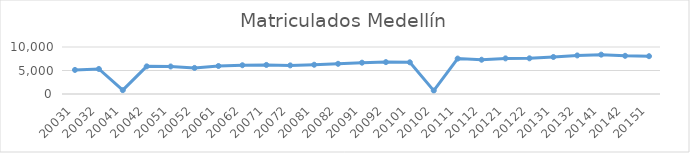
| Category | Matriculados Medellín |
|---|---|
| 20031 | 5121 |
| 20032 | 5326 |
| 20041 | 814 |
| 20042 | 5878 |
| 20051 | 5853 |
| 20052 | 5546 |
| 20061 | 5957 |
| 20062 | 6121 |
| 20071 | 6184 |
| 20072 | 6090 |
| 20081 | 6225 |
| 20082 | 6424 |
| 20091 | 6664 |
| 20092 | 6784 |
| 20101 | 6742 |
| 20102 | 724 |
| 20111 | 7537 |
| 20112 | 7292 |
| 20121 | 7579 |
| 20122 | 7593 |
| 20131 | 7874 |
| 20132 | 8206 |
| 20141 | 8374 |
| 20142 | 8123 |
| 20151 | 8043 |